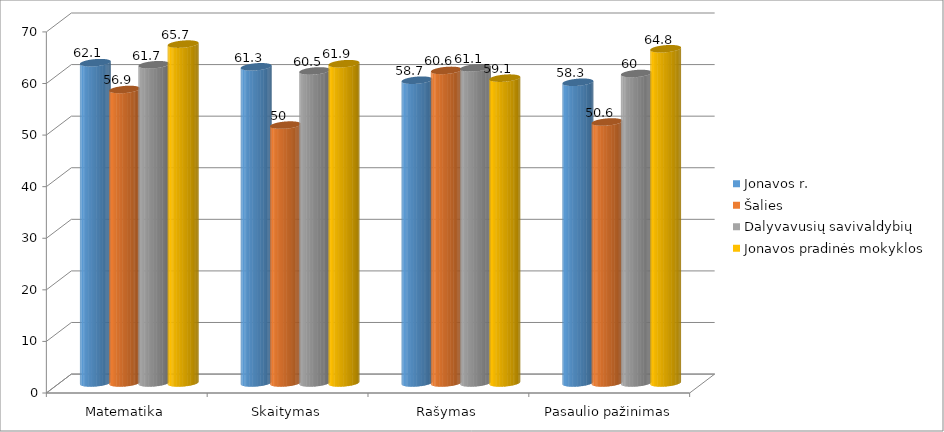
| Category | Jonavos r. | Šalies | Dalyvavusių savivaldybių | Jonavos pradinės mokyklos |
|---|---|---|---|---|
| Matematika | 62.1 | 56.9 | 61.7 | 65.7 |
| Skaitymas | 61.3 | 50 | 60.5 | 61.9 |
| Rašymas | 58.7 | 60.6 | 61.1 | 59.1 |
| Pasaulio pažinimas | 58.3 | 50.6 | 60 | 64.8 |